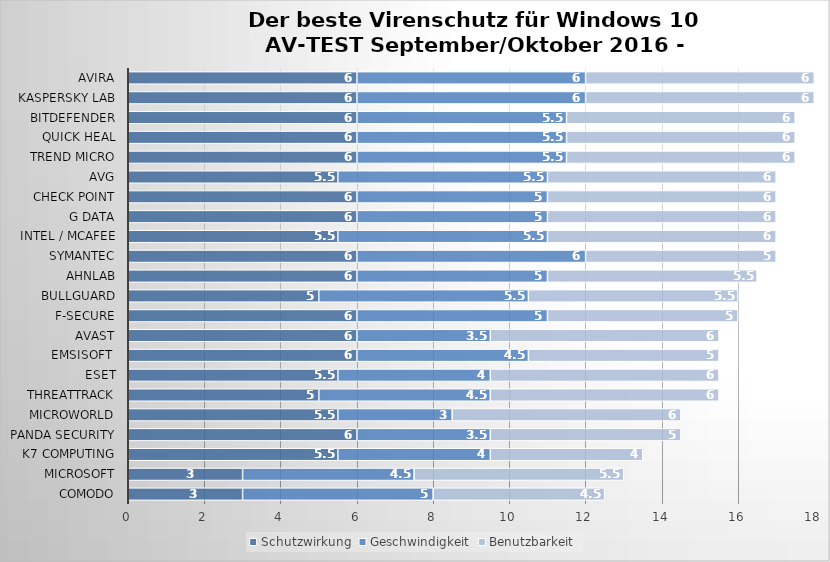
| Category | Schutzwirkung | Geschwindigkeit | Benutzbarkeit |
|---|---|---|---|
| Comodo | 3 | 5 | 4.5 |
| Microsoft | 3 | 4.5 | 5.5 |
| K7 Computing | 5.5 | 4 | 4 |
| Panda Security | 6 | 3.5 | 5 |
| Microworld | 5.5 | 3 | 6 |
| ThreatTrack | 5 | 4.5 | 6 |
| ESET | 5.5 | 4 | 6 |
| Emsisoft  | 6 | 4.5 | 5 |
| Avast | 6 | 3.5 | 6 |
| F-Secure | 6 | 5 | 5 |
| BullGuard | 5 | 5.5 | 5.5 |
| AhnLab | 6 | 5 | 5.5 |
| Symantec | 6 | 6 | 5 |
| Intel / McAfee | 5.5 | 5.5 | 6 |
| G Data | 6 | 5 | 6 |
| Check Point | 6 | 5 | 6 |
| AVG | 5.5 | 5.5 | 6 |
| Trend Micro | 6 | 5.5 | 6 |
| Quick Heal | 6 | 5.5 | 6 |
| Bitdefender | 6 | 5.5 | 6 |
| Kaspersky Lab | 6 | 6 | 6 |
| Avira | 6 | 6 | 6 |